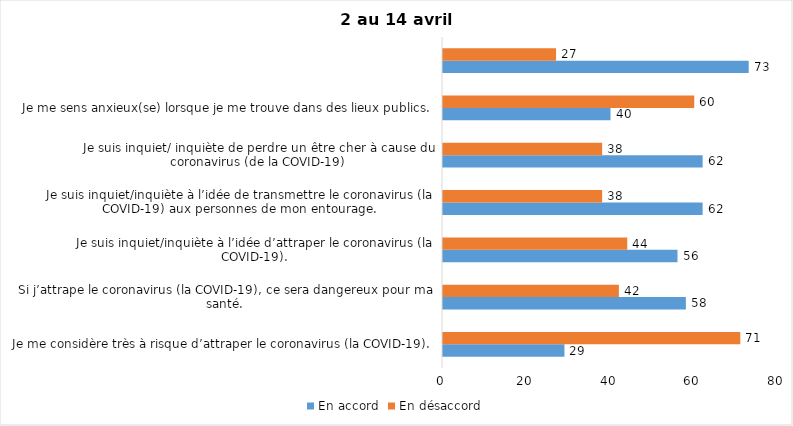
| Category | En accord | En désaccord |
|---|---|---|
| Je me considère très à risque d’attraper le coronavirus (la COVID-19). | 29 | 71 |
| Si j’attrape le coronavirus (la COVID-19), ce sera dangereux pour ma santé. | 58 | 42 |
| Je suis inquiet/inquiète à l’idée d’attraper le coronavirus (la COVID-19). | 56 | 44 |
| Je suis inquiet/inquiète à l’idée de transmettre le coronavirus (la COVID-19) aux personnes de mon entourage. | 62 | 38 |
| Je suis inquiet/ inquiète de perdre un être cher à cause du coronavirus (de la COVID-19) | 62 | 38 |
| Je me sens anxieux(se) lorsque je me trouve dans des lieux publics. | 40 | 60 |